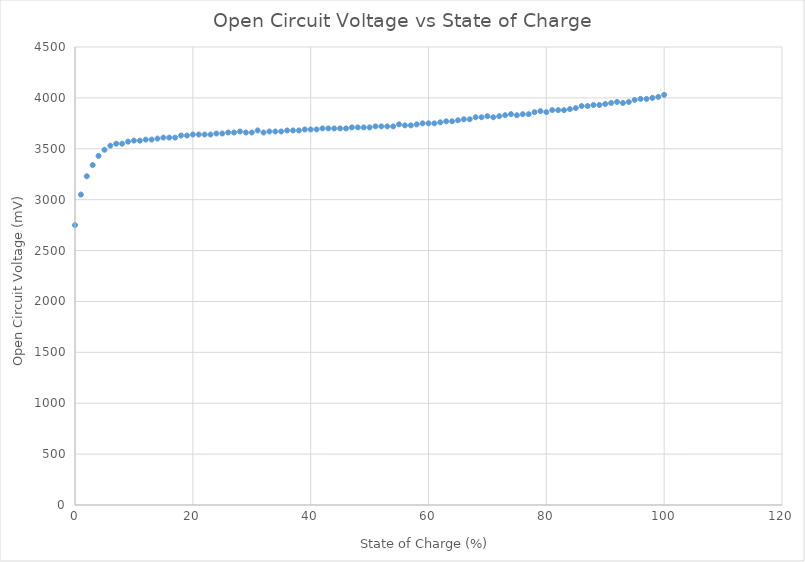
| Category | Series 0 |
|---|---|
| 100.0 | 4030 |
| 99.0 | 4010 |
| 98.0 | 4000 |
| 97.0 | 3990 |
| 96.0 | 3990 |
| 95.0 | 3980 |
| 94.0 | 3960 |
| 93.0 | 3950 |
| 92.0 | 3960 |
| 91.0 | 3950 |
| 90.0 | 3940 |
| 89.0 | 3930 |
| 88.0 | 3930 |
| 87.0 | 3920 |
| 86.0 | 3920 |
| 85.0 | 3900 |
| 84.0 | 3890 |
| 83.0 | 3880 |
| 82.0 | 3880 |
| 81.0 | 3880 |
| 80.0 | 3860 |
| 79.0 | 3870 |
| 78.0 | 3860 |
| 77.0 | 3840 |
| 76.0 | 3840 |
| 75.0 | 3830 |
| 74.0 | 3840 |
| 73.0 | 3830 |
| 72.0 | 3820 |
| 71.0 | 3810 |
| 70.0 | 3820 |
| 69.0 | 3810 |
| 68.0 | 3810 |
| 67.0 | 3790 |
| 66.0 | 3790 |
| 65.0 | 3780 |
| 64.0 | 3770 |
| 63.0 | 3770 |
| 62.0 | 3760 |
| 61.0 | 3750 |
| 60.0 | 3750 |
| 59.0 | 3750 |
| 58.0 | 3740 |
| 57.0 | 3730 |
| 56.0 | 3730 |
| 55.0 | 3740 |
| 54.0 | 3720 |
| 53.0 | 3720 |
| 52.0 | 3720 |
| 51.0 | 3720 |
| 50.0 | 3710 |
| 49.0 | 3710 |
| 48.0 | 3710 |
| 47.0 | 3710 |
| 46.0 | 3700 |
| 45.0 | 3700 |
| 44.0 | 3700 |
| 43.0 | 3700 |
| 42.0 | 3700 |
| 41.0 | 3690 |
| 40.0 | 3690 |
| 39.0 | 3690 |
| 38.0 | 3680 |
| 37.0 | 3680 |
| 36.0 | 3680 |
| 35.0 | 3670 |
| 34.0 | 3670 |
| 33.0 | 3670 |
| 32.0 | 3660 |
| 31.0 | 3680 |
| 30.0 | 3660 |
| 29.0 | 3660 |
| 28.0 | 3670 |
| 27.0 | 3660 |
| 26.0 | 3660 |
| 25.0 | 3650 |
| 24.0 | 3650 |
| 23.0 | 3640 |
| 22.0 | 3640 |
| 21.0 | 3640 |
| 20.0 | 3640 |
| 19.0 | 3630 |
| 18.0 | 3630 |
| 17.0 | 3610 |
| 16.0 | 3610 |
| 15.0 | 3610 |
| 14.0 | 3600 |
| 13.0 | 3590 |
| 12.0 | 3590 |
| 11.0 | 3580 |
| 10.0 | 3580 |
| 9.0 | 3570 |
| 8.0 | 3550 |
| 7.0 | 3550 |
| 6.0 | 3530 |
| 5.0 | 3490 |
| 4.0 | 3430 |
| 3.0 | 3340 |
| 2.0 | 3230 |
| 1.0 | 3050 |
| 0.0 | 2750 |